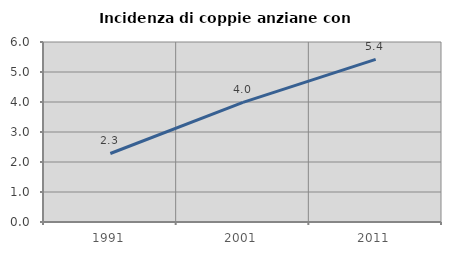
| Category | Incidenza di coppie anziane con figli |
|---|---|
| 1991.0 | 2.283 |
| 2001.0 | 3.989 |
| 2011.0 | 5.421 |